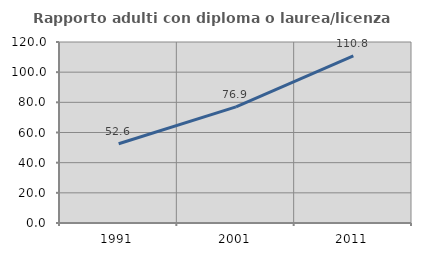
| Category | Rapporto adulti con diploma o laurea/licenza media  |
|---|---|
| 1991.0 | 52.577 |
| 2001.0 | 76.945 |
| 2011.0 | 110.787 |